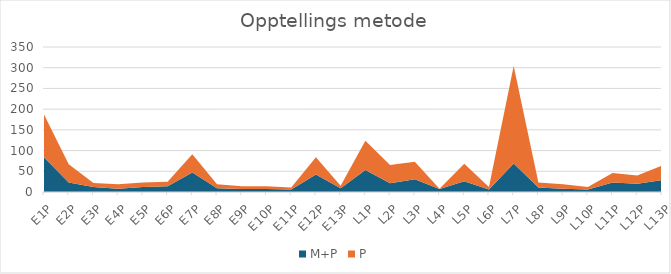
| Category | M+P | P |
|---|---|---|
| E1P | 84 | 103 |
| E2P | 23 | 44 |
| E3P | 12 | 10 |
| E4P | 8 | 11 |
| E5P | 12 | 11 |
| E6P | 14 | 11 |
| E7P | 47 | 44 |
| E8P | 9 | 10 |
| E9P | 7 | 7 |
| E10P | 7 | 7 |
| E11P | 6 | 5 |
| E12P | 42 | 42 |
| E13P | 9 | 6 |
| L1P | 53 | 71 |
| L2P | 21 | 44 |
| L3P | 31 | 42 |
| L4P | 7 | 1 |
| L5P | 26 | 42 |
| L6P | 6 | 6 |
| L7P | 69 | 235 |
| L8P | 11 | 12 |
| L9P | 8 | 11 |
| L10P | 6 | 6 |
| L11P | 23 | 23 |
| L12P | 20 | 20 |
| L13P | 29 | 35 |